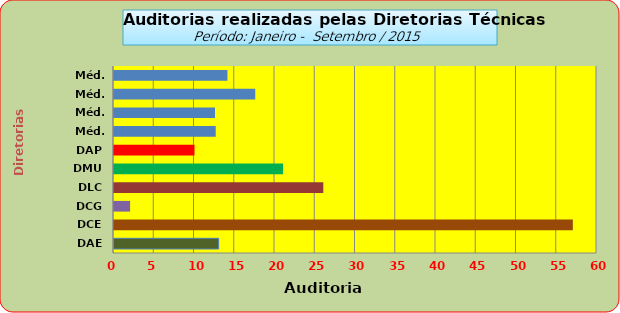
| Category | Series 0 |
|---|---|
| DAE | 13 |
| DCE | 57 |
| DCG | 2 |
| DLC | 26 |
| DMU | 21 |
| DAP | 10 |
| Méd. 2011 | 12.636 |
| Méd. 2012 | 12.545 |
| Méd. 2013 | 17.545 |
| Méd. 2014 | 14.091 |